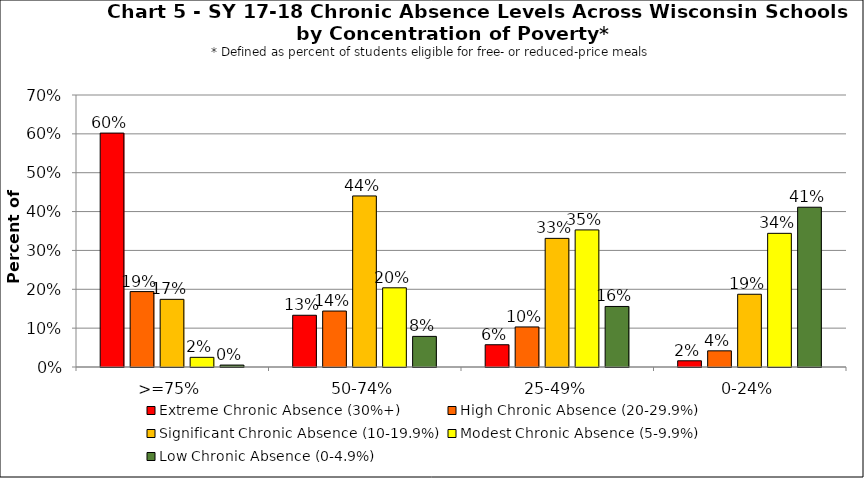
| Category | Extreme Chronic Absence (30%+) | High Chronic Absence (20-29.9%) | Significant Chronic Absence (10-19.9%) | Modest Chronic Absence (5-9.9%) | Low Chronic Absence (0-4.9%) |
|---|---|---|---|---|---|
| 0 | 0.602 | 0.194 | 0.174 | 0.025 | 0.005 |
| 1 | 0.133 | 0.144 | 0.44 | 0.204 | 0.079 |
| 2 | 0.057 | 0.103 | 0.331 | 0.353 | 0.156 |
| 3 | 0.016 | 0.042 | 0.187 | 0.344 | 0.411 |